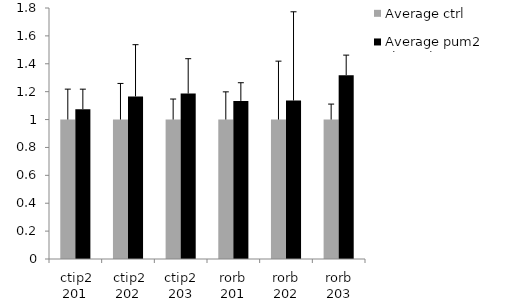
| Category | Average ctrl | Average pum2 cko/ctrl |
|---|---|---|
|  ctip2 201 | 1 | 1.075 |
|  ctip2 202 | 1 | 1.166 |
| ctip2 203 | 1 | 1.186 |
| rorb 201 | 1 | 1.134 |
| rorb 202 | 1 | 1.136 |
| rorb 203 | 1 | 1.318 |